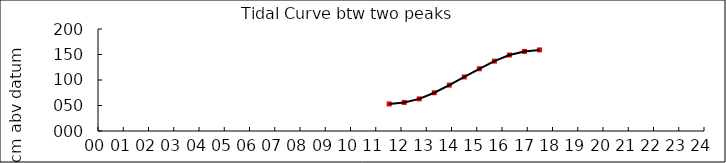
| Category | Height cm |
|---|---|
| 11.53333333333333 | 53 |
| 12.12833333333333 | 56 |
| 12.72333333333333 | 63 |
| 13.31833333333333 | 75 |
| 13.91333333333333 | 90 |
| 14.50833333333333 | 106 |
| 15.10333333333333 | 122 |
| 15.69833333333333 | 137 |
| 16.29333333333333 | 149 |
| 16.88833333333334 | 156 |
| 17.48333333333333 | 159 |